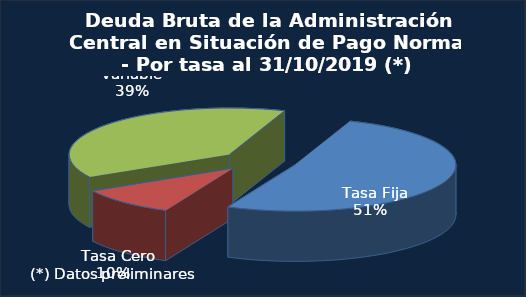
| Category | Series 0 |
|---|---|
|   Tasa Fija | 158054.3 |
|   Tasa Cero | 30793.9 |
|   Tasa Variable | 119100.6 |